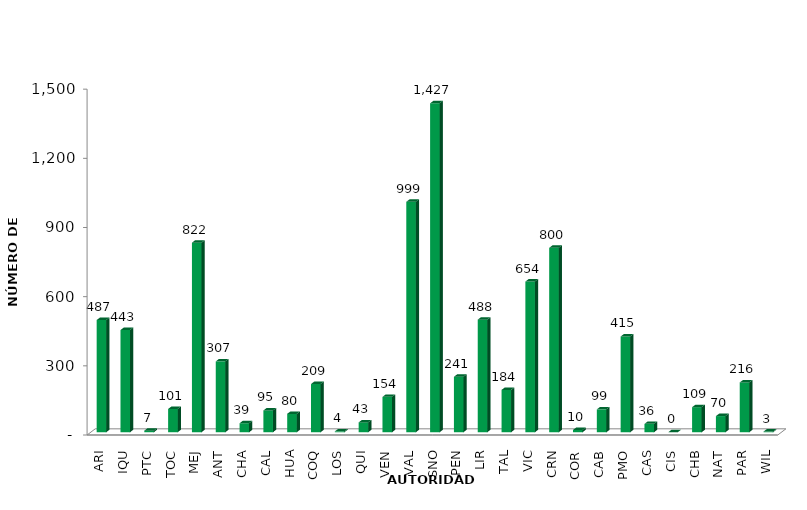
| Category | Series 0 |
|---|---|
| ARI | 486.75 |
| IQU | 443.25 |
| PTC | 6.833 |
| TOC | 100.917 |
| MEJ | 822.25 |
| ANT | 307.417 |
| CHA | 39 |
| CAL | 94.5 |
| HUA | 79.583 |
| COQ | 209.083 |
| LOS | 3.75 |
| QUI | 42.75 |
| VEN | 153.5 |
| VAL | 999.417 |
| SNO | 1426.667 |
| PEN | 240.583 |
| LIR | 488.333 |
| TAL | 183.583 |
| VIC | 653.583 |
| CRN | 799.917 |
| COR | 10 |
| CAB | 99.167 |
| PMO | 415.25 |
| CAS | 36.333 |
| CIS | 0.083 |
| CHB | 108.667 |
| NAT | 70.083 |
| PAR | 215.917 |
| WIL | 3 |